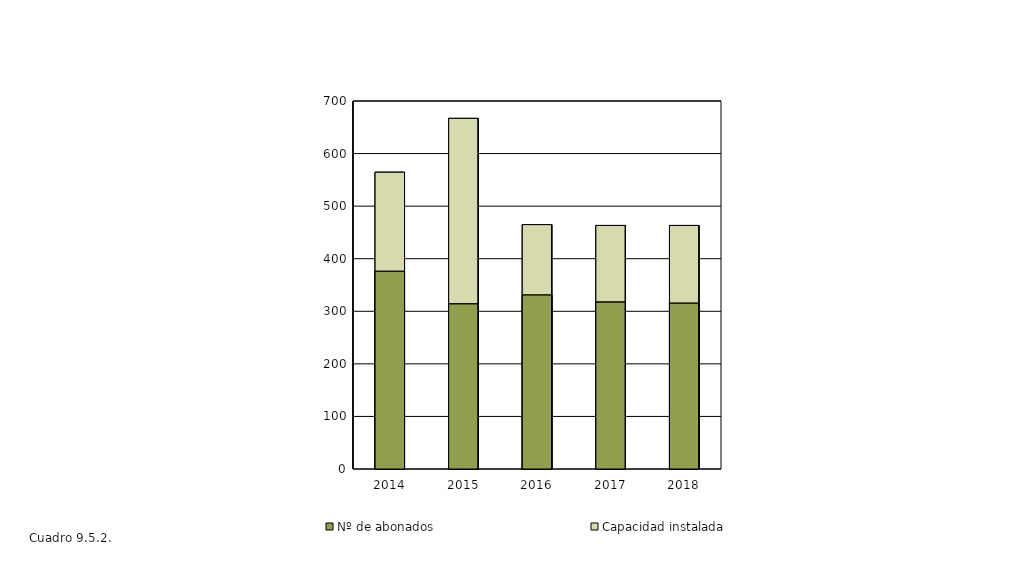
| Category | Nº de abonados | Capacidad instalada |
|---|---|---|
| 2014.0 | 375.988 | 564.522 |
| 2015.0 | 313.982 | 666.971 |
| 2016.0 | 330.845 | 464.837 |
| 2017.0 | 317.405 | 463.253 |
| 2018.0 | 315.296 | 463.253 |